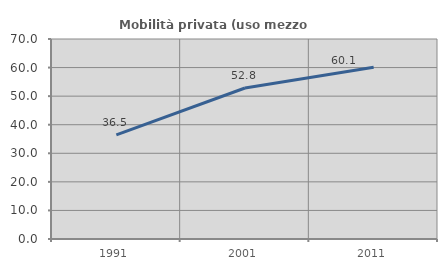
| Category | Mobilità privata (uso mezzo privato) |
|---|---|
| 1991.0 | 36.472 |
| 2001.0 | 52.844 |
| 2011.0 | 60.12 |